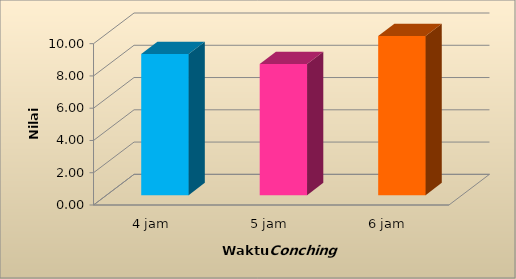
| Category | Rata-rata |
|---|---|
| 4 jam | 8.742 |
| 5 jam | 8.132 |
| 6 jam | 9.861 |